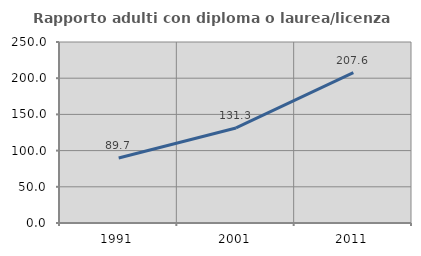
| Category | Rapporto adulti con diploma o laurea/licenza media  |
|---|---|
| 1991.0 | 89.686 |
| 2001.0 | 131.318 |
| 2011.0 | 207.626 |